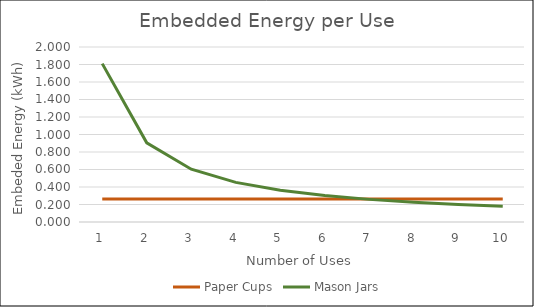
| Category | Paper Cups | Mason Jars |
|---|---|---|
| 0 | 0.262 | 1.81 |
| 1 | 0.262 | 0.905 |
| 2 | 0.262 | 0.603 |
| 3 | 0.262 | 0.452 |
| 4 | 0.262 | 0.362 |
| 5 | 0.262 | 0.302 |
| 6 | 0.262 | 0.259 |
| 7 | 0.262 | 0.226 |
| 8 | 0.262 | 0.201 |
| 9 | 0.262 | 0.181 |